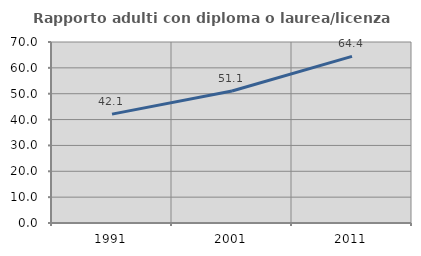
| Category | Rapporto adulti con diploma o laurea/licenza media  |
|---|---|
| 1991.0 | 42.105 |
| 2001.0 | 51.056 |
| 2011.0 | 64.431 |